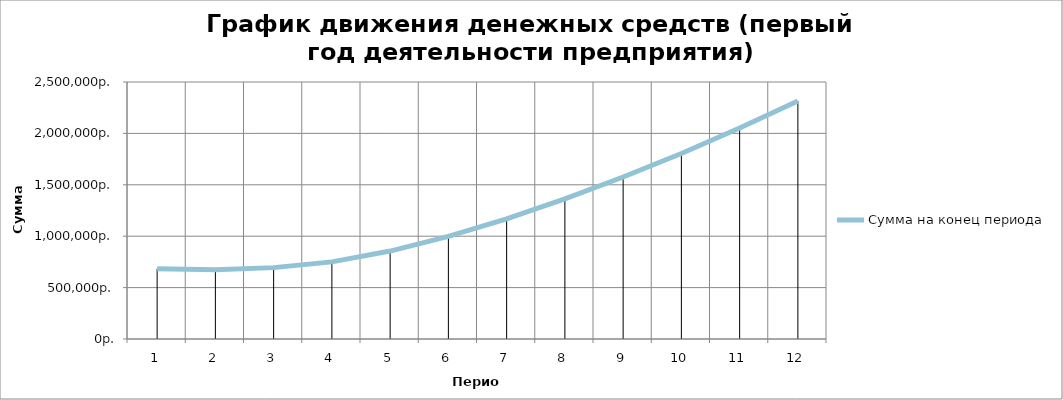
| Category | Сумма на конец периода |
|---|---|
| 0 | 683460 |
| 1 | 674060 |
| 2 | 694285 |
| 3 | 750356.25 |
| 4 | 855501.312 |
| 5 | 997775.388 |
| 6 | 1167881.557 |
| 7 | 1363048.344 |
| 8 | 1575664.565 |
| 9 | 1804952.947 |
| 10 | 2051898.327 |
| 11 | 2315215.976 |